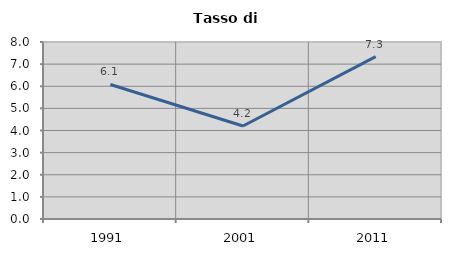
| Category | Tasso di disoccupazione   |
|---|---|
| 1991.0 | 6.08 |
| 2001.0 | 4.203 |
| 2011.0 | 7.341 |